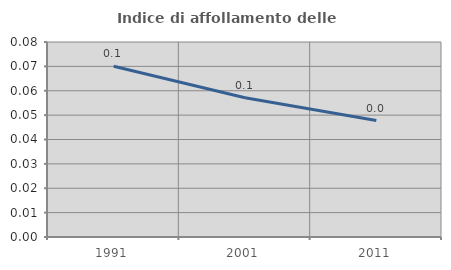
| Category | Indice di affollamento delle abitazioni  |
|---|---|
| 1991.0 | 0.07 |
| 2001.0 | 0.057 |
| 2011.0 | 0.048 |